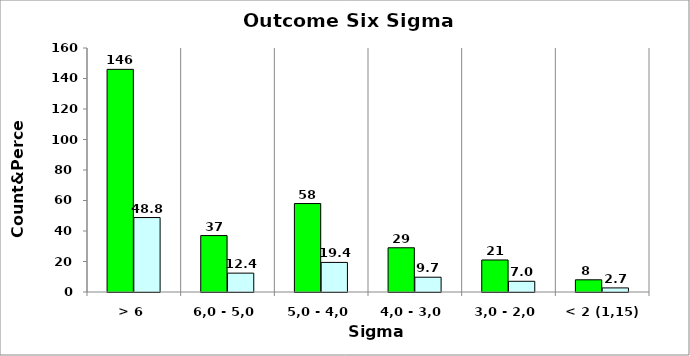
| Category | Series 0 | 48,8 12,4 19,4 9,7 7,0 2,7 |
|---|---|---|
| > 6 | 146 | 48.829 |
| 6,0 - 5,0 | 37 | 12.375 |
| 5,0 - 4,0 | 58 | 19.398 |
| 4,0 - 3,0 | 29 | 9.699 |
| 3,0 - 2,0 | 21 | 7.023 |
| < 2 (1,15) | 8 | 2.676 |